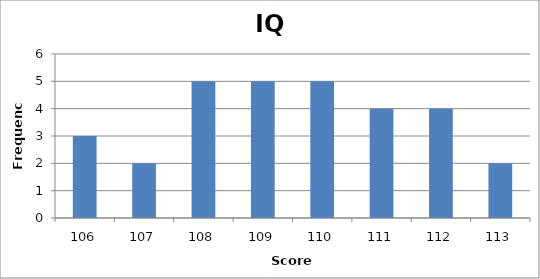
| Category | Series 0 |
|---|---|
| 106.0 | 3 |
| 107.0 | 2 |
| 108.0 | 5 |
| 109.0 | 5 |
| 110.0 | 5 |
| 111.0 | 4 |
| 112.0 | 4 |
| 113.0 | 2 |